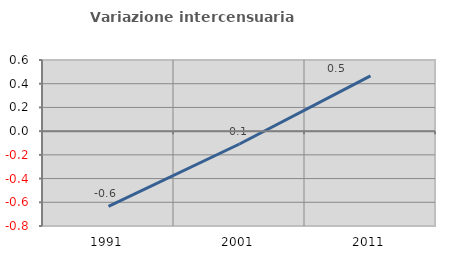
| Category | Variazione intercensuaria annua |
|---|---|
| 1991.0 | -0.635 |
| 2001.0 | -0.108 |
| 2011.0 | 0.466 |